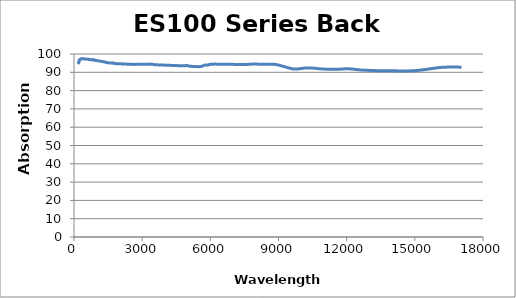
| Category | Absorption (%) |
|---|---|
| 200.0 | 94.9 |
| 202.0 | 94.906 |
| 204.0 | 94.451 |
| 206.0 | 94.565 |
| 208.0 | 94.714 |
| 210.0 | 95.898 |
| 212.0 | 95.777 |
| 214.0 | 96.016 |
| 216.0 | 95.686 |
| 218.0 | 95.842 |
| 220.0 | 95.925 |
| 222.0 | 96.03 |
| 224.0 | 96.13 |
| 226.0 | 96.323 |
| 228.0 | 96.469 |
| 230.0 | 96.668 |
| 232.0 | 96.718 |
| 234.0 | 96.805 |
| 236.0 | 96.687 |
| 238.0 | 96.768 |
| 240.0 | 96.78 |
| 242.0 | 96.878 |
| 244.0 | 96.848 |
| 246.0 | 96.856 |
| 248.0 | 96.927 |
| 250.0 | 96.94 |
| 252.0 | 96.94 |
| 254.0 | 96.911 |
| 256.0 | 96.938 |
| 258.0 | 96.993 |
| 260.0 | 97.017 |
| 262.0 | 96.984 |
| 264.0 | 96.994 |
| 266.0 | 96.977 |
| 268.0 | 97.013 |
| 270.0 | 97.019 |
| 272.0 | 97.066 |
| 274.0 | 97.087 |
| 276.0 | 97.06 |
| 278.0 | 97.005 |
| 280.0 | 97.033 |
| 282.0 | 97.066 |
| 284.0 | 97.166 |
| 286.0 | 97.166 |
| 288.0 | 97.174 |
| 290.0 | 97.152 |
| 292.0 | 97.176 |
| 294.0 | 97.251 |
| 296.0 | 97.253 |
| 298.0 | 97.251 |
| 300.0 | 97.266 |
| 302.0 | 97.312 |
| 304.0 | 97.325 |
| 306.0 | 97.298 |
| 308.0 | 97.262 |
| 310.0 | 97.27 |
| 312.0 | 97.294 |
| 314.0 | 97.327 |
| 316.0 | 97.349 |
| 318.0 | 97.375 |
| 320.0 | 97.405 |
| 322.0 | 97.432 |
| 324.0 | 97.42 |
| 326.0 | 97.444 |
| 328.0 | 97.423 |
| 330.0 | 97.414 |
| 332.0 | 97.402 |
| 334.0 | 97.417 |
| 336.0 | 97.426 |
| 338.0 | 97.402 |
| 340.0 | 97.38 |
| 342.0 | 97.375 |
| 344.0 | 97.371 |
| 346.0 | 97.423 |
| 348.0 | 97.453 |
| 350.0 | 97.496 |
| 352.0 | 97.476 |
| 354.0 | 97.467 |
| 356.0 | 97.434 |
| 358.0 | 97.407 |
| 360.0 | 97.374 |
| 362.0 | 97.355 |
| 364.0 | 97.393 |
| 366.0 | 97.416 |
| 368.0 | 97.455 |
| 370.0 | 97.434 |
| 372.0 | 97.439 |
| 374.0 | 97.436 |
| 376.0 | 97.426 |
| 378.0 | 97.422 |
| 380.0 | 97.422 |
| 382.0 | 97.437 |
| 384.0 | 97.436 |
| 386.0 | 97.425 |
| 388.0 | 97.404 |
| 390.0 | 97.386 |
| 392.0 | 97.381 |
| 394.0 | 97.388 |
| 396.0 | 97.406 |
| 398.0 | 97.413 |
| 400.0 | 97.419 |
| 402.0 | 97.417 |
| 404.0 | 97.418 |
| 406.0 | 97.414 |
| 408.0 | 97.423 |
| 410.0 | 97.429 |
| 412.0 | 97.436 |
| 414.0 | 97.433 |
| 416.0 | 97.423 |
| 418.0 | 97.422 |
| 420.0 | 97.401 |
| 422.0 | 97.401 |
| 424.0 | 97.384 |
| 426.0 | 97.398 |
| 428.0 | 97.388 |
| 430.0 | 97.39 |
| 432.0 | 97.376 |
| 434.0 | 97.366 |
| 436.0 | 97.355 |
| 438.0 | 97.353 |
| 440.0 | 97.373 |
| 442.0 | 97.386 |
| 444.0 | 97.391 |
| 446.0 | 97.38 |
| 448.0 | 97.378 |
| 450.0 | 97.369 |
| 452.0 | 97.355 |
| 454.0 | 97.34 |
| 456.0 | 97.333 |
| 458.0 | 97.322 |
| 460.0 | 97.319 |
| 462.0 | 97.318 |
| 464.0 | 97.33 |
| 466.0 | 97.328 |
| 468.0 | 97.322 |
| 470.0 | 97.323 |
| 472.0 | 97.313 |
| 474.0 | 97.326 |
| 476.0 | 97.326 |
| 478.0 | 97.331 |
| 480.0 | 97.327 |
| 482.0 | 97.316 |
| 484.0 | 97.32 |
| 486.0 | 97.315 |
| 488.0 | 97.317 |
| 490.0 | 97.308 |
| 492.0 | 97.303 |
| 494.0 | 97.309 |
| 496.0 | 97.315 |
| 498.0 | 97.324 |
| 500.0 | 97.312 |
| 502.0 | 97.3 |
| 504.0 | 97.292 |
| 506.0 | 97.291 |
| 508.0 | 97.295 |
| 510.0 | 97.281 |
| 512.0 | 97.28 |
| 514.0 | 97.271 |
| 516.0 | 97.273 |
| 518.0 | 97.269 |
| 520.0 | 97.282 |
| 522.0 | 97.281 |
| 524.0 | 97.267 |
| 526.0 | 97.25 |
| 528.0 | 97.247 |
| 530.0 | 97.252 |
| 532.0 | 97.248 |
| 534.0 | 97.246 |
| 536.0 | 97.25 |
| 538.0 | 97.246 |
| 540.0 | 97.243 |
| 542.0 | 97.237 |
| 544.0 | 97.244 |
| 546.0 | 97.232 |
| 548.0 | 97.228 |
| 550.0 | 97.222 |
| 552.0 | 97.227 |
| 554.0 | 97.222 |
| 556.0 | 97.215 |
| 558.0 | 97.208 |
| 560.0 | 97.2 |
| 562.0 | 97.209 |
| 564.0 | 97.206 |
| 566.0 | 97.198 |
| 568.0 | 97.192 |
| 570.0 | 97.191 |
| 572.0 | 97.194 |
| 574.0 | 97.194 |
| 576.0 | 97.174 |
| 578.0 | 97.173 |
| 580.0 | 97.156 |
| 582.0 | 97.164 |
| 584.0 | 97.154 |
| 586.0 | 97.156 |
| 588.0 | 97.156 |
| 590.0 | 97.16 |
| 592.0 | 97.152 |
| 594.0 | 97.149 |
| 596.0 | 97.147 |
| 598.0 | 97.146 |
| 600.0 | 97.135 |
| 602.0 | 97.127 |
| 604.0 | 97.13 |
| 606.0 | 97.134 |
| 608.0 | 97.128 |
| 610.0 | 97.124 |
| 612.0 | 97.128 |
| 614.0 | 97.145 |
| 616.0 | 97.136 |
| 618.0 | 97.127 |
| 620.0 | 97.115 |
| 622.0 | 97.117 |
| 624.0 | 97.108 |
| 626.0 | 97.099 |
| 628.0 | 97.094 |
| 630.0 | 97.102 |
| 632.0 | 97.098 |
| 634.0 | 97.104 |
| 636.0 | 97.09 |
| 638.0 | 97.091 |
| 640.0 | 97.074 |
| 642.0 | 97.082 |
| 644.0 | 97.064 |
| 646.0 | 97.058 |
| 648.0 | 97.025 |
| 650.0 | 97.021 |
| 652.0 | 97.03 |
| 654.0 | 97.03 |
| 656.0 | 97.038 |
| 658.0 | 96.999 |
| 660.0 | 97.002 |
| 662.0 | 96.994 |
| 664.0 | 97.014 |
| 666.0 | 97.019 |
| 668.0 | 97.015 |
| 670.0 | 97.016 |
| 672.0 | 97.022 |
| 674.0 | 97.025 |
| 676.0 | 97.023 |
| 678.0 | 97.015 |
| 680.0 | 97.005 |
| 682.0 | 97.002 |
| 684.0 | 96.995 |
| 686.0 | 96.995 |
| 688.0 | 96.971 |
| 690.0 | 96.965 |
| 692.0 | 96.966 |
| 694.0 | 96.969 |
| 696.0 | 96.98 |
| 698.0 | 96.982 |
| 700.0 | 96.998 |
| 702.0 | 96.981 |
| 704.0 | 96.942 |
| 706.0 | 96.927 |
| 708.0 | 96.908 |
| 710.0 | 96.93 |
| 712.0 | 96.909 |
| 714.0 | 96.915 |
| 716.0 | 96.895 |
| 718.0 | 96.871 |
| 720.0 | 96.874 |
| 722.0 | 96.894 |
| 724.0 | 96.898 |
| 726.0 | 96.922 |
| 728.0 | 96.921 |
| 730.0 | 96.918 |
| 732.0 | 96.914 |
| 734.0 | 96.91 |
| 736.0 | 96.906 |
| 738.0 | 96.902 |
| 740.0 | 96.9 |
| 742.0 | 96.892 |
| 744.0 | 96.891 |
| 746.0 | 96.883 |
| 748.0 | 96.88 |
| 750.0 | 96.874 |
| 752.0 | 96.877 |
| 754.0 | 96.877 |
| 756.0 | 96.877 |
| 758.0 | 96.874 |
| 760.0 | 96.869 |
| 762.0 | 96.865 |
| 764.0 | 96.857 |
| 766.0 | 96.854 |
| 768.0 | 96.851 |
| 770.0 | 96.85 |
| 772.0 | 96.845 |
| 774.0 | 96.845 |
| 776.0 | 96.839 |
| 778.0 | 96.836 |
| 780.0 | 96.838 |
| 782.0 | 96.834 |
| 784.0 | 96.826 |
| 786.0 | 96.822 |
| 788.0 | 96.82 |
| 790.0 | 96.815 |
| 792.0 | 96.812 |
| 794.0 | 96.81 |
| 796.0 | 96.805 |
| 798.0 | 96.797 |
| 800.0 | 96.788 |
| 802.0 | 96.784 |
| 804.0 | 96.779 |
| 806.0 | 96.775 |
| 808.0 | 96.772 |
| 810.0 | 96.766 |
| 812.0 | 96.766 |
| 814.0 | 96.763 |
| 816.0 | 96.762 |
| 818.0 | 96.755 |
| 820.0 | 96.752 |
| 822.0 | 96.749 |
| 824.0 | 96.749 |
| 826.0 | 96.745 |
| 828.0 | 96.766 |
| 830.0 | 96.755 |
| 832.0 | 96.79 |
| 834.0 | 96.844 |
| 836.0 | 96.835 |
| 838.0 | 96.935 |
| 840.0 | 96.977 |
| 842.0 | 96.947 |
| 844.0 | 96.849 |
| 846.0 | 96.939 |
| 848.0 | 96.837 |
| 850.0 | 96.854 |
| 852.0 | 96.842 |
| 854.0 | 96.893 |
| 856.0 | 96.891 |
| 858.0 | 96.887 |
| 860.0 | 96.882 |
| 862.0 | 96.914 |
| 864.0 | 96.926 |
| 866.0 | 96.796 |
| 868.0 | 96.716 |
| 870.0 | 96.699 |
| 872.0 | 96.72 |
| 874.0 | 96.726 |
| 876.0 | 96.78 |
| 878.0 | 96.827 |
| 880.0 | 96.806 |
| 882.0 | 96.773 |
| 884.0 | 96.723 |
| 886.0 | 96.68 |
| 888.0 | 96.666 |
| 890.0 | 96.67 |
| 892.0 | 96.656 |
| 894.0 | 96.678 |
| 896.0 | 96.715 |
| 898.0 | 96.711 |
| 900.0 | 96.662 |
| 902.0 | 96.625 |
| 904.0 | 96.612 |
| 906.0 | 96.592 |
| 908.0 | 96.594 |
| 910.0 | 96.609 |
| 912.0 | 96.621 |
| 914.0 | 96.607 |
| 916.0 | 96.594 |
| 918.0 | 96.584 |
| 920.0 | 96.568 |
| 922.0 | 96.565 |
| 924.0 | 96.541 |
| 926.0 | 96.542 |
| 928.0 | 96.552 |
| 930.0 | 96.561 |
| 932.0 | 96.552 |
| 934.0 | 96.56 |
| 936.0 | 96.538 |
| 938.0 | 96.52 |
| 940.0 | 96.51 |
| 942.0 | 96.498 |
| 944.0 | 96.488 |
| 946.0 | 96.495 |
| 948.0 | 96.503 |
| 950.0 | 96.489 |
| 952.0 | 96.473 |
| 954.0 | 96.469 |
| 956.0 | 96.472 |
| 958.0 | 96.461 |
| 960.0 | 96.459 |
| 962.0 | 96.467 |
| 964.0 | 96.47 |
| 966.0 | 96.454 |
| 968.0 | 96.45 |
| 970.0 | 96.447 |
| 972.0 | 96.441 |
| 974.0 | 96.438 |
| 976.0 | 96.434 |
| 978.0 | 96.43 |
| 980.0 | 96.427 |
| 982.0 | 96.423 |
| 984.0 | 96.421 |
| 986.0 | 96.424 |
| 988.0 | 96.426 |
| 990.0 | 96.418 |
| 992.0 | 96.416 |
| 994.0 | 96.407 |
| 996.0 | 96.402 |
| 998.0 | 96.392 |
| 1000.0 | 96.395 |
| 1002.0 | 96.386 |
| 1004.0 | 96.386 |
| 1006.0 | 96.38 |
| 1008.0 | 96.379 |
| 1010.0 | 96.374 |
| 1012.0 | 96.37 |
| 1014.0 | 96.366 |
| 1016.0 | 96.368 |
| 1018.0 | 96.362 |
| 1020.0 | 96.359 |
| 1022.0 | 96.359 |
| 1024.0 | 96.356 |
| 1026.0 | 96.346 |
| 1028.0 | 96.345 |
| 1030.0 | 96.34 |
| 1032.0 | 96.335 |
| 1034.0 | 96.329 |
| 1036.0 | 96.329 |
| 1038.0 | 96.327 |
| 1040.0 | 96.324 |
| 1042.0 | 96.323 |
| 1044.0 | 96.319 |
| 1046.0 | 96.315 |
| 1048.0 | 96.31 |
| 1050.0 | 96.304 |
| 1052.0 | 96.298 |
| 1054.0 | 96.291 |
| 1056.0 | 96.285 |
| 1058.0 | 96.279 |
| 1060.0 | 96.277 |
| 1062.0 | 96.275 |
| 1064.0 | 96.272 |
| 1066.0 | 96.268 |
| 1068.0 | 96.259 |
| 1070.0 | 96.255 |
| 1072.0 | 96.25 |
| 1074.0 | 96.25 |
| 1076.0 | 96.243 |
| 1078.0 | 96.242 |
| 1080.0 | 96.234 |
| 1082.0 | 96.229 |
| 1084.0 | 96.223 |
| 1086.0 | 96.22 |
| 1088.0 | 96.218 |
| 1090.0 | 96.216 |
| 1092.0 | 96.212 |
| 1094.0 | 96.204 |
| 1096.0 | 96.197 |
| 1098.0 | 96.193 |
| 1100.0 | 96.187 |
| 1102.0 | 96.184 |
| 1104.0 | 96.18 |
| 1106.0 | 96.18 |
| 1108.0 | 96.175 |
| 1110.0 | 96.169 |
| 1112.0 | 96.163 |
| 1114.0 | 96.161 |
| 1116.0 | 96.158 |
| 1118.0 | 96.15 |
| 1120.0 | 96.149 |
| 1122.0 | 96.148 |
| 1124.0 | 96.146 |
| 1126.0 | 96.14 |
| 1128.0 | 96.138 |
| 1130.0 | 96.136 |
| 1132.0 | 96.131 |
| 1134.0 | 96.124 |
| 1136.0 | 96.119 |
| 1138.0 | 96.112 |
| 1140.0 | 96.106 |
| 1142.0 | 96.103 |
| 1144.0 | 96.098 |
| 1146.0 | 96.092 |
| 1148.0 | 96.089 |
| 1150.0 | 96.08 |
| 1152.0 | 96.072 |
| 1154.0 | 96.068 |
| 1156.0 | 96.064 |
| 1158.0 | 96.061 |
| 1160.0 | 96.061 |
| 1162.0 | 96.056 |
| 1164.0 | 96.048 |
| 1166.0 | 96.045 |
| 1168.0 | 96.04 |
| 1170.0 | 96.037 |
| 1172.0 | 96.035 |
| 1174.0 | 96.032 |
| 1176.0 | 96.029 |
| 1178.0 | 96.024 |
| 1180.0 | 96.017 |
| 1182.0 | 96.014 |
| 1184.0 | 96.011 |
| 1186.0 | 96.007 |
| 1188.0 | 96.005 |
| 1190.0 | 96.001 |
| 1192.0 | 95.994 |
| 1194.0 | 95.992 |
| 1196.0 | 95.987 |
| 1198.0 | 95.982 |
| 1200.0 | 95.979 |
| 1202.0 | 95.975 |
| 1204.0 | 95.971 |
| 1206.0 | 95.966 |
| 1208.0 | 95.964 |
| 1210.0 | 95.963 |
| 1212.0 | 95.96 |
| 1214.0 | 95.953 |
| 1216.0 | 95.948 |
| 1218.0 | 95.944 |
| 1220.0 | 95.94 |
| 1222.0 | 95.937 |
| 1224.0 | 95.936 |
| 1226.0 | 95.934 |
| 1228.0 | 95.926 |
| 1230.0 | 95.92 |
| 1232.0 | 95.915 |
| 1234.0 | 95.911 |
| 1236.0 | 95.908 |
| 1238.0 | 95.907 |
| 1240.0 | 95.903 |
| 1242.0 | 95.9 |
| 1244.0 | 95.894 |
| 1246.0 | 95.886 |
| 1248.0 | 95.882 |
| 1250.0 | 95.878 |
| 1252.0 | 95.877 |
| 1254.0 | 95.873 |
| 1256.0 | 95.871 |
| 1258.0 | 95.864 |
| 1260.0 | 95.86 |
| 1262.0 | 95.852 |
| 1264.0 | 95.846 |
| 1266.0 | 95.842 |
| 1268.0 | 95.838 |
| 1270.0 | 95.835 |
| 1272.0 | 95.829 |
| 1274.0 | 95.828 |
| 1276.0 | 95.824 |
| 1278.0 | 95.819 |
| 1280.0 | 95.817 |
| 1282.0 | 95.814 |
| 1284.0 | 95.81 |
| 1286.0 | 95.807 |
| 1288.0 | 95.802 |
| 1290.0 | 95.797 |
| 1292.0 | 95.795 |
| 1294.0 | 95.793 |
| 1296.0 | 95.789 |
| 1298.0 | 95.788 |
| 1300.0 | 95.781 |
| 1302.0 | 95.778 |
| 1304.0 | 95.775 |
| 1306.0 | 95.771 |
| 1308.0 | 95.768 |
| 1310.0 | 95.767 |
| 1312.0 | 95.761 |
| 1314.0 | 95.748 |
| 1316.0 | 95.741 |
| 1318.0 | 95.735 |
| 1320.0 | 95.728 |
| 1322.0 | 95.725 |
| 1324.0 | 95.724 |
| 1326.0 | 95.724 |
| 1328.0 | 95.721 |
| 1330.0 | 95.714 |
| 1332.0 | 95.706 |
| 1334.0 | 95.7 |
| 1336.0 | 95.694 |
| 1338.0 | 95.685 |
| 1340.0 | 95.684 |
| 1342.0 | 95.68 |
| 1344.0 | 95.674 |
| 1346.0 | 95.667 |
| 1348.0 | 95.665 |
| 1350.0 | 95.659 |
| 1352.0 | 95.654 |
| 1354.0 | 95.652 |
| 1356.0 | 95.644 |
| 1358.0 | 95.639 |
| 1360.0 | 95.634 |
| 1362.0 | 95.627 |
| 1364.0 | 95.622 |
| 1366.0 | 95.615 |
| 1368.0 | 95.605 |
| 1370.0 | 95.597 |
| 1372.0 | 95.592 |
| 1374.0 | 95.586 |
| 1376.0 | 95.584 |
| 1378.0 | 95.582 |
| 1380.0 | 95.575 |
| 1382.0 | 95.566 |
| 1384.0 | 95.556 |
| 1386.0 | 95.543 |
| 1388.0 | 95.529 |
| 1390.0 | 95.516 |
| 1392.0 | 95.501 |
| 1394.0 | 95.485 |
| 1396.0 | 95.474 |
| 1398.0 | 95.46 |
| 1400.0 | 95.449 |
| 1402.0 | 95.439 |
| 1404.0 | 95.429 |
| 1406.0 | 95.417 |
| 1408.0 | 95.406 |
| 1410.0 | 95.389 |
| 1412.0 | 95.372 |
| 1414.0 | 95.357 |
| 1416.0 | 95.347 |
| 1418.0 | 95.335 |
| 1420.0 | 95.326 |
| 1422.0 | 95.317 |
| 1424.0 | 95.309 |
| 1426.0 | 95.295 |
| 1428.0 | 95.282 |
| 1430.0 | 95.275 |
| 1432.0 | 95.268 |
| 1434.0 | 95.259 |
| 1436.0 | 95.252 |
| 1438.0 | 95.244 |
| 1440.0 | 95.237 |
| 1442.0 | 95.229 |
| 1444.0 | 95.225 |
| 1446.0 | 95.221 |
| 1448.0 | 95.222 |
| 1450.0 | 95.219 |
| 1452.0 | 95.214 |
| 1454.0 | 95.207 |
| 1456.0 | 95.2 |
| 1458.0 | 95.197 |
| 1460.0 | 95.192 |
| 1462.0 | 95.192 |
| 1464.0 | 95.191 |
| 1466.0 | 95.188 |
| 1468.0 | 95.187 |
| 1470.0 | 95.186 |
| 1472.0 | 95.182 |
| 1474.0 | 95.177 |
| 1476.0 | 95.178 |
| 1478.0 | 95.171 |
| 1480.0 | 95.168 |
| 1482.0 | 95.167 |
| 1484.0 | 95.173 |
| 1486.0 | 95.168 |
| 1488.0 | 95.172 |
| 1490.0 | 95.169 |
| 1492.0 | 95.169 |
| 1494.0 | 95.166 |
| 1496.0 | 95.174 |
| 1498.0 | 95.167 |
| 1500.0 | 95.167 |
| 1502.0 | 95.17 |
| 1504.0 | 95.17 |
| 1506.0 | 95.167 |
| 1508.0 | 95.172 |
| 1510.0 | 95.174 |
| 1512.0 | 95.172 |
| 1514.0 | 95.173 |
| 1516.0 | 95.167 |
| 1518.0 | 95.165 |
| 1520.0 | 95.166 |
| 1522.0 | 95.162 |
| 1524.0 | 95.161 |
| 1526.0 | 95.161 |
| 1528.0 | 95.16 |
| 1530.0 | 95.161 |
| 1532.0 | 95.164 |
| 1534.0 | 95.158 |
| 1536.0 | 95.156 |
| 1538.0 | 95.157 |
| 1540.0 | 95.153 |
| 1542.0 | 95.146 |
| 1544.0 | 95.148 |
| 1546.0 | 95.149 |
| 1548.0 | 95.144 |
| 1550.0 | 95.139 |
| 1552.0 | 95.137 |
| 1554.0 | 95.13 |
| 1556.0 | 95.132 |
| 1558.0 | 95.131 |
| 1560.0 | 95.13 |
| 1562.0 | 95.128 |
| 1564.0 | 95.13 |
| 1566.0 | 95.122 |
| 1568.0 | 95.118 |
| 1570.0 | 95.115 |
| 1572.0 | 95.115 |
| 1574.0 | 95.11 |
| 1576.0 | 95.105 |
| 1578.0 | 95.104 |
| 1580.0 | 95.1 |
| 1582.0 | 95.096 |
| 1584.0 | 95.095 |
| 1586.0 | 95.095 |
| 1588.0 | 95.09 |
| 1590.0 | 95.096 |
| 1592.0 | 95.1 |
| 1594.0 | 95.094 |
| 1596.0 | 95.086 |
| 1598.0 | 95.084 |
| 1600.0 | 95.08 |
| 1602.0 | 95.074 |
| 1604.0 | 95.077 |
| 1606.0 | 95.077 |
| 1608.0 | 95.081 |
| 1610.0 | 95.075 |
| 1612.0 | 95.07 |
| 1614.0 | 95.066 |
| 1616.0 | 95.062 |
| 1618.0 | 95.055 |
| 1620.0 | 95.055 |
| 1622.0 | 95.053 |
| 1624.0 | 95.048 |
| 1626.0 | 95.049 |
| 1628.0 | 95.048 |
| 1630.0 | 95.045 |
| 1632.0 | 95.044 |
| 1634.0 | 95.047 |
| 1636.0 | 95.048 |
| 1638.0 | 95.043 |
| 1640.0 | 95.041 |
| 1642.0 | 95.039 |
| 1644.0 | 95.034 |
| 1646.0 | 95.026 |
| 1648.0 | 95.043 |
| 1650.0 | 95.065 |
| 1652.0 | 95.068 |
| 1654.0 | 95.112 |
| 1656.0 | 95.132 |
| 1658.0 | 95.124 |
| 1660.0 | 95.112 |
| 1662.0 | 95.122 |
| 1664.0 | 95.106 |
| 1666.0 | 95.115 |
| 1668.0 | 95.159 |
| 1670.0 | 95.184 |
| 1672.0 | 95.167 |
| 1674.0 | 95.171 |
| 1676.0 | 95.178 |
| 1678.0 | 95.178 |
| 1680.0 | 95.134 |
| 1682.0 | 95.16 |
| 1684.0 | 95.143 |
| 1686.0 | 95.116 |
| 1688.0 | 95.037 |
| 1690.0 | 95.089 |
| 1692.0 | 95.057 |
| 1694.0 | 95.037 |
| 1696.0 | 95.052 |
| 1698.0 | 95.052 |
| 1700.0 | 95.043 |
| 1702.0 | 95.021 |
| 1704.0 | 95.019 |
| 1706.0 | 95.002 |
| 1708.0 | 95.033 |
| 1710.0 | 94.972 |
| 1712.0 | 95.001 |
| 1714.0 | 95.02 |
| 1716.0 | 94.956 |
| 1718.0 | 95.007 |
| 1720.0 | 95 |
| 1722.0 | 94.987 |
| 1724.0 | 94.934 |
| 1726.0 | 95.06 |
| 1728.0 | 95.015 |
| 1730.0 | 95.011 |
| 1732.0 | 94.996 |
| 1734.0 | 95.071 |
| 1736.0 | 94.976 |
| 1738.0 | 94.893 |
| 1740.0 | 94.965 |
| 1742.0 | 95.034 |
| 1744.0 | 94.983 |
| 1746.0 | 94.971 |
| 1748.0 | 95.073 |
| 1750.0 | 95.053 |
| 1752.0 | 94.932 |
| 1754.0 | 94.947 |
| 1756.0 | 94.991 |
| 1758.0 | 94.952 |
| 1760.0 | 94.901 |
| 1762.0 | 95.002 |
| 1764.0 | 94.962 |
| 1766.0 | 94.935 |
| 1768.0 | 94.92 |
| 1770.0 | 94.918 |
| 1772.0 | 94.882 |
| 1774.0 | 94.876 |
| 1776.0 | 94.91 |
| 1778.0 | 94.906 |
| 1780.0 | 94.95 |
| 1782.0 | 94.911 |
| 1784.0 | 94.936 |
| 1786.0 | 94.882 |
| 1788.0 | 94.869 |
| 1790.0 | 94.827 |
| 1792.0 | 94.832 |
| 1794.0 | 94.802 |
| 1796.0 | 94.775 |
| 1798.0 | 94.805 |
| 1800.0 | 94.828 |
| 1805.0 | 94.802 |
| 1810.0 | 94.791 |
| 1815.0 | 94.791 |
| 1821.0 | 94.768 |
| 1826.0 | 94.745 |
| 1831.0 | 94.743 |
| 1836.0 | 94.745 |
| 1841.0 | 94.739 |
| 1846.0 | 94.728 |
| 1852.0 | 94.732 |
| 1857.0 | 94.752 |
| 1862.0 | 94.765 |
| 1868.0 | 94.771 |
| 1873.0 | 94.77 |
| 1879.0 | 94.747 |
| 1884.0 | 94.713 |
| 1889.0 | 94.701 |
| 1895.0 | 94.709 |
| 1901.0 | 94.707 |
| 1906.0 | 94.692 |
| 1912.0 | 94.676 |
| 1917.0 | 94.671 |
| 1923.0 | 94.68 |
| 1929.0 | 94.692 |
| 1935.0 | 94.698 |
| 1940.0 | 94.69 |
| 1946.0 | 94.674 |
| 1952.0 | 94.663 |
| 1958.0 | 94.667 |
| 1964.0 | 94.678 |
| 1970.0 | 94.683 |
| 1976.0 | 94.679 |
| 1982.0 | 94.671 |
| 1988.0 | 94.667 |
| 1994.0 | 94.668 |
| 2000.0 | 94.662 |
| 2006.0 | 94.649 |
| 2013.0 | 94.642 |
| 2019.0 | 94.648 |
| 2025.0 | 94.655 |
| 2032.0 | 94.65 |
| 2038.0 | 94.646 |
| 2044.0 | 94.645 |
| 2051.0 | 94.63 |
| 2057.0 | 94.608 |
| 2064.0 | 94.602 |
| 2071.0 | 94.609 |
| 2077.0 | 94.612 |
| 2084.0 | 94.613 |
| 2091.0 | 94.611 |
| 2097.0 | 94.588 |
| 2104.0 | 94.57 |
| 2111.0 | 94.584 |
| 2118.0 | 94.605 |
| 2125.0 | 94.598 |
| 2132.0 | 94.582 |
| 2139.0 | 94.574 |
| 2146.0 | 94.561 |
| 2153.0 | 94.548 |
| 2160.0 | 94.548 |
| 2168.0 | 94.551 |
| 2175.0 | 94.54 |
| 2182.0 | 94.527 |
| 2190.0 | 94.534 |
| 2197.0 | 94.541 |
| 2204.0 | 94.529 |
| 2212.0 | 94.519 |
| 2220.0 | 94.522 |
| 2227.0 | 94.523 |
| 2235.0 | 94.512 |
| 2243.0 | 94.503 |
| 2250.0 | 94.501 |
| 2258.0 | 94.5 |
| 2266.0 | 94.502 |
| 2274.0 | 94.51 |
| 2282.0 | 94.512 |
| 2290.0 | 94.493 |
| 2298.0 | 94.47 |
| 2306.0 | 94.462 |
| 2315.0 | 94.466 |
| 2323.0 | 94.469 |
| 2331.0 | 94.464 |
| 2340.0 | 94.457 |
| 2348.0 | 94.455 |
| 2357.0 | 94.454 |
| 2365.0 | 94.451 |
| 2374.0 | 94.45 |
| 2383.0 | 94.45 |
| 2392.0 | 94.442 |
| 2400.0 | 94.43 |
| 2409.0 | 94.42 |
| 2418.0 | 94.413 |
| 2427.0 | 94.41 |
| 2436.0 | 94.414 |
| 2446.0 | 94.418 |
| 2455.0 | 94.41 |
| 2464.0 | 94.397 |
| 2474.0 | 94.385 |
| 2483.0 | 94.378 |
| 2493.0 | 94.379 |
| 2502.0 | 94.386 |
| 2512.0 | 94.393 |
| 2522.0 | 94.394 |
| 2532.0 | 94.384 |
| 2542.0 | 94.371 |
| 2552.0 | 94.364 |
| 2562.0 | 94.359 |
| 2572.0 | 94.348 |
| 2582.0 | 94.341 |
| 2592.0 | 94.339 |
| 2603.0 | 94.337 |
| 2613.0 | 94.331 |
| 2624.0 | 94.327 |
| 2635.0 | 94.324 |
| 2645.0 | 94.321 |
| 2656.0 | 94.321 |
| 2667.0 | 94.325 |
| 2678.0 | 94.324 |
| 2689.0 | 94.319 |
| 2700.0 | 94.323 |
| 2712.0 | 94.339 |
| 2723.0 | 94.354 |
| 2735.0 | 94.362 |
| 2746.0 | 94.368 |
| 2758.0 | 94.379 |
| 2770.0 | 94.394 |
| 2782.0 | 94.408 |
| 2794.0 | 94.421 |
| 2806.0 | 94.424 |
| 2818.0 | 94.416 |
| 2830.0 | 94.415 |
| 2843.0 | 94.427 |
| 2855.0 | 94.439 |
| 2868.0 | 94.444 |
| 2880.0 | 94.445 |
| 2893.0 | 94.45 |
| 2906.0 | 94.459 |
| 2919.0 | 94.46 |
| 2933.0 | 94.453 |
| 2946.0 | 94.453 |
| 2959.0 | 94.455 |
| 2973.0 | 94.447 |
| 2987.0 | 94.436 |
| 3000.0 | 94.429 |
| 3014.0 | 94.422 |
| 3028.0 | 94.422 |
| 3043.0 | 94.424 |
| 3057.0 | 94.422 |
| 3072.0 | 94.412 |
| 3086.0 | 94.404 |
| 3101.0 | 94.401 |
| 3116.0 | 94.396 |
| 3131.0 | 94.385 |
| 3146.0 | 94.377 |
| 3161.0 | 94.376 |
| 3177.0 | 94.367 |
| 3193.0 | 94.352 |
| 3208.0 | 94.34 |
| 3224.0 | 94.341 |
| 3240.0 | 94.344 |
| 3257.0 | 94.342 |
| 3273.0 | 94.338 |
| 3290.0 | 94.332 |
| 3307.0 | 94.33 |
| 3324.0 | 94.34 |
| 3341.0 | 94.377 |
| 3358.0 | 94.435 |
| 3376.0 | 94.484 |
| 3393.0 | 94.499 |
| 3411.0 | 94.475 |
| 3429.0 | 94.425 |
| 3447.0 | 94.372 |
| 3466.0 | 94.344 |
| 3484.0 | 94.327 |
| 3503.0 | 94.288 |
| 3522.0 | 94.223 |
| 3542.0 | 94.164 |
| 3561.0 | 94.131 |
| 3581.0 | 94.116 |
| 3601.0 | 94.107 |
| 3621.0 | 94.093 |
| 3641.0 | 94.081 |
| 3662.0 | 94.075 |
| 3682.0 | 94.067 |
| 3703.0 | 94.054 |
| 3725.0 | 94.039 |
| 3746.0 | 94.024 |
| 3768.0 | 94.011 |
| 3790.0 | 93.999 |
| 3812.0 | 93.989 |
| 3835.0 | 93.983 |
| 3858.0 | 93.977 |
| 3881.0 | 93.971 |
| 3904.0 | 93.963 |
| 3928.0 | 93.955 |
| 3952.0 | 93.945 |
| 3976.0 | 93.932 |
| 4001.0 | 93.915 |
| 4025.0 | 93.902 |
| 4051.0 | 93.891 |
| 4076.0 | 93.879 |
| 4102.0 | 93.863 |
| 4128.0 | 93.847 |
| 4154.0 | 93.833 |
| 4181.0 | 93.82 |
| 4208.0 | 93.805 |
| 4236.0 | 93.793 |
| 4264.0 | 93.784 |
| 4292.0 | 93.775 |
| 4321.0 | 93.759 |
| 4350.0 | 93.735 |
| 4379.0 | 93.715 |
| 4409.0 | 93.695 |
| 4439.0 | 93.677 |
| 4470.0 | 93.663 |
| 4501.0 | 93.656 |
| 4532.0 | 93.652 |
| 4564.0 | 93.639 |
| 4596.0 | 93.618 |
| 4629.0 | 93.598 |
| 4663.0 | 93.582 |
| 4696.0 | 93.568 |
| 4731.0 | 93.557 |
| 4765.0 | 93.55 |
| 4801.0 | 93.542 |
| 4837.0 | 93.527 |
| 4873.0 | 93.543 |
| 4910.0 | 93.641 |
| 4947.0 | 93.745 |
| 4985.0 | 93.688 |
| 5024.0 | 93.506 |
| 5063.0 | 93.369 |
| 5103.0 | 93.311 |
| 5144.0 | 93.278 |
| 5185.0 | 93.248 |
| 5227.0 | 93.223 |
| 5269.0 | 93.205 |
| 5312.0 | 93.186 |
| 5356.0 | 93.153 |
| 5401.0 | 93.115 |
| 5446.0 | 93.091 |
| 5492.0 | 93.088 |
| 5539.0 | 93.107 |
| 5587.0 | 93.161 |
| 5636.0 | 93.31 |
| 5685.0 | 93.587 |
| 5735.0 | 93.861 |
| 5787.0 | 93.956 |
| 5839.0 | 93.939 |
| 5892.0 | 94.003 |
| 5946.0 | 94.176 |
| 6001.0 | 94.344 |
| 6057.0 | 94.429 |
| 6114.0 | 94.454 |
| 6172.0 | 94.468 |
| 6232.0 | 94.471 |
| 6292.0 | 94.451 |
| 6354.0 | 94.421 |
| 6417.0 | 94.402 |
| 6481.0 | 94.417 |
| 6546.0 | 94.452 |
| 6613.0 | 94.453 |
| 6681.0 | 94.421 |
| 6751.0 | 94.41 |
| 6822.0 | 94.41 |
| 6895.0 | 94.38 |
| 6969.0 | 94.345 |
| 7045.0 | 94.322 |
| 7122.0 | 94.292 |
| 7201.0 | 94.257 |
| 7282.0 | 94.229 |
| 7365.0 | 94.213 |
| 7449.0 | 94.217 |
| 7536.0 | 94.257 |
| 7625.0 | 94.326 |
| 7715.0 | 94.393 |
| 7808.0 | 94.445 |
| 7904.0 | 94.491 |
| 8001.0 | 94.501 |
| 8101.0 | 94.448 |
| 8204.0 | 94.385 |
| 8309.0 | 94.359 |
| 8417.0 | 94.35 |
| 8528.0 | 94.353 |
| 8641.0 | 94.385 |
| 8758.0 | 94.397 |
| 8878.0 | 94.279 |
| 9001.0 | 93.969 |
| 9128.0 | 93.52 |
| 9259.0 | 93.056 |
| 9393.0 | 92.607 |
| 9531.0 | 92.128 |
| 9673.0 | 91.775 |
| 9820.0 | 91.779 |
| 9971.0 | 92.047 |
| 10127.0 | 92.295 |
| 10287.0 | 92.401 |
| 10453.0 | 92.351 |
| 10625.0 | 92.164 |
| 10802.0 | 91.936 |
| 10985.0 | 91.772 |
| 11174.0 | 91.702 |
| 11370.0 | 91.666 |
| 11573.0 | 91.645 |
| 11784.0 | 91.773 |
| 12002.0 | 91.929 |
| 12228.0 | 91.795 |
| 12463.0 | 91.455 |
| 12708.0 | 91.205 |
| 12962.0 | 91.056 |
| 13226.0 | 90.928 |
| 13502.0 | 90.835 |
| 13789.0 | 90.798 |
| 14089.0 | 90.789 |
| 14402.0 | 90.761 |
| 14730.0 | 90.753 |
| 15072.0 | 90.953 |
| 15431.0 | 91.476 |
| 15807.0 | 92.168 |
| 16202.0 | 92.708 |
| 16618.0 | 92.877 |
| 17055.0 | 92.797 |